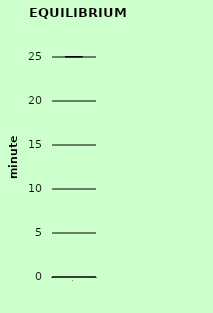
| Category | Series 0 |
|---|---|
| 0 | 1716125714.619 |